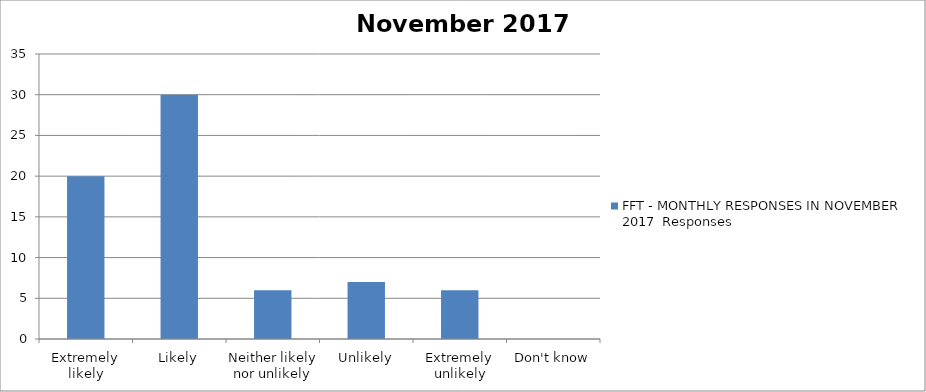
| Category | FFT - MONTHLY RESPONSES IN NOVEMBER 2017 |
|---|---|
| Extremely likely | 20 |
| Likely | 30 |
| Neither likely nor unlikely | 6 |
| Unlikely | 7 |
| Extremely unlikely | 6 |
| Don't know | 0 |